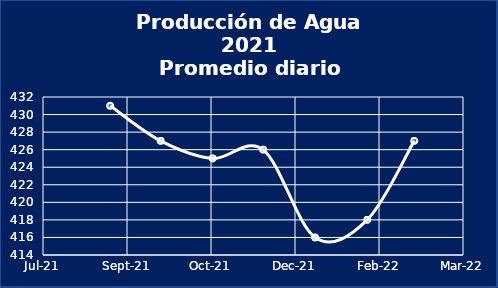
| Category | Series 0 |
|---|---|
| 44440.0 | 431 |
| 44470.0 | 427 |
| 44501.0 | 425 |
| 44531.0 | 426 |
| 44562.0 | 416 |
| 44593.0 | 418 |
| 44621.0 | 427 |